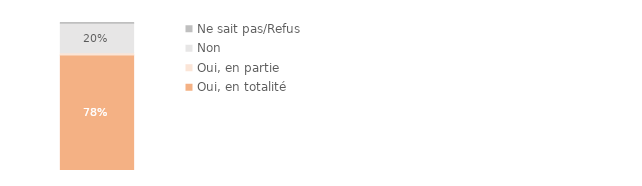
| Category | Oui, en totalité | Oui, en partie | Non | Ne sait pas/Refus |
|---|---|---|---|---|
| 0 | 0.781 | 0.014 | 0.2 | 0.005 |